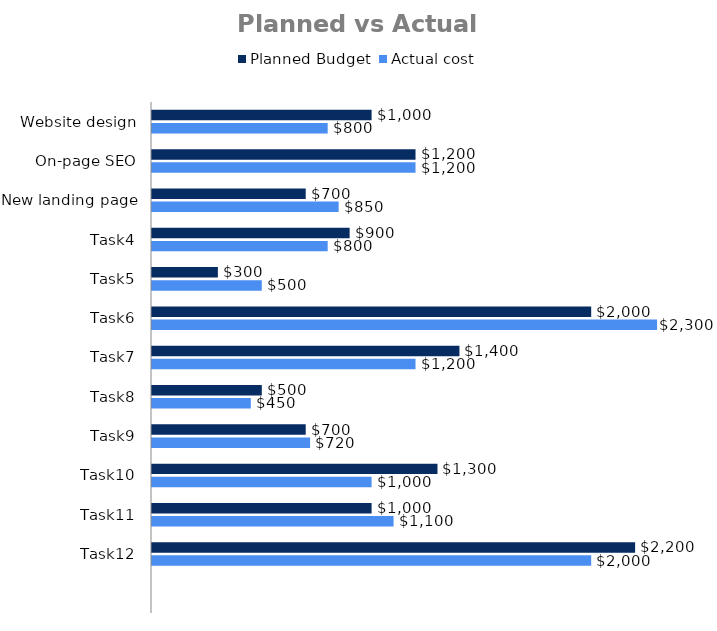
| Category | Planned Budget | Actual cost |
|---|---|---|
| Website design | 1000 | 800 |
| On-page SEO | 1200 | 1200 |
| New landing page | 700 | 850 |
| Task4 | 900 | 800 |
| Task5 | 300 | 500 |
| Task6 | 2000 | 2300 |
| Task7 | 1400 | 1200 |
| Task8 | 500 | 450 |
| Task9 | 700 | 720 |
| Task10 | 1300 | 1000 |
| Task11 | 1000 | 1100 |
| Task12 | 2200 | 2000 |